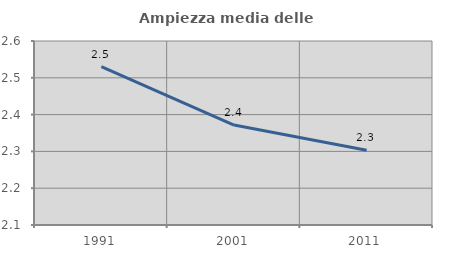
| Category | Ampiezza media delle famiglie |
|---|---|
| 1991.0 | 2.53 |
| 2001.0 | 2.372 |
| 2011.0 | 2.303 |